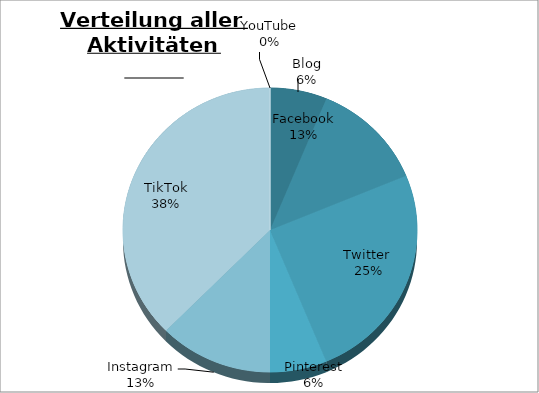
| Category | Series 0 |
|---|---|
| Blog | 1 |
| Facebook | 2 |
| Twitter  | 4 |
| Pinterest | 1 |
| Instagram | 2 |
| TikTok | 6 |
| YouTube | 0 |